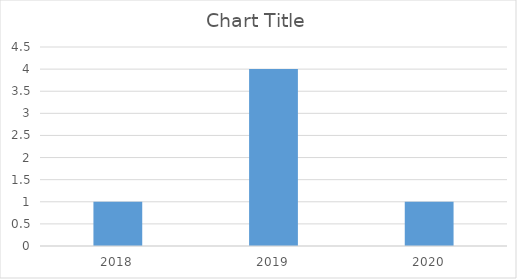
| Category | Series 0 |
|---|---|
| 2018.0 | 1 |
| 2019.0 | 4 |
| 2020.0 | 1 |